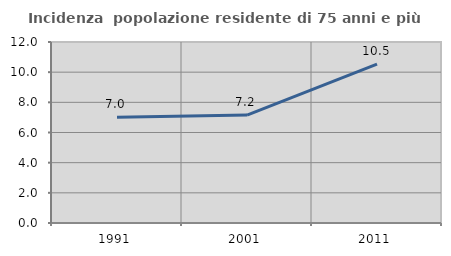
| Category | Incidenza  popolazione residente di 75 anni e più |
|---|---|
| 1991.0 | 7.014 |
| 2001.0 | 7.152 |
| 2011.0 | 10.538 |